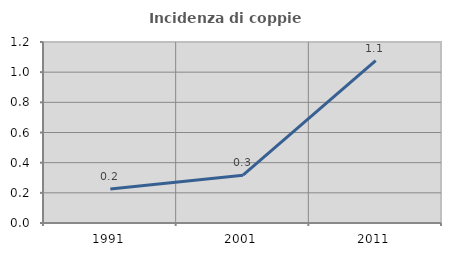
| Category | Incidenza di coppie miste |
|---|---|
| 1991.0 | 0.226 |
| 2001.0 | 0.317 |
| 2011.0 | 1.076 |